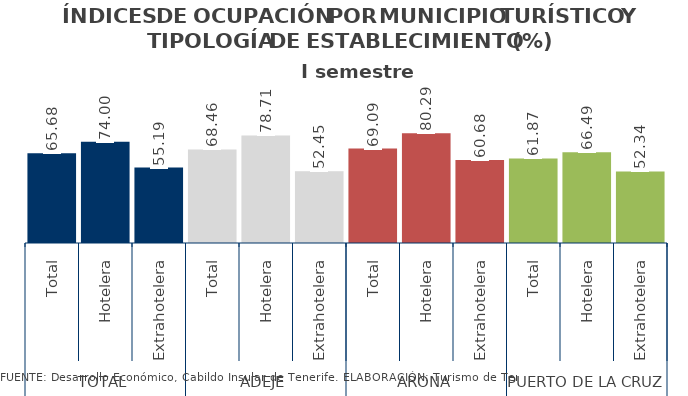
| Category | I semestre 2014 |
|---|---|
| 0 | 65.677 |
| 1 | 73.998 |
| 2 | 55.189 |
| 3 | 68.456 |
| 4 | 78.709 |
| 5 | 52.451 |
| 6 | 69.095 |
| 7 | 80.286 |
| 8 | 60.682 |
| 9 | 61.87 |
| 10 | 66.488 |
| 11 | 52.335 |